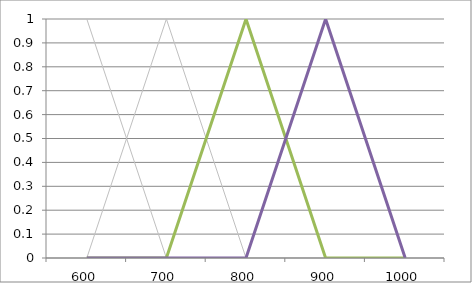
| Category | 600 | 700 | 800 | 900 |
|---|---|---|---|---|
| 600.0 | 1 | 0 | 0 | 0 |
| 700.0 | 0 | 1 | 0 | 0 |
| 800.0 | 0 | 0 | 1 | 0 |
| 900.0 | 0 | 0 | 0 | 1 |
| 1000.0 | 0 | 0 | 0 | 0 |